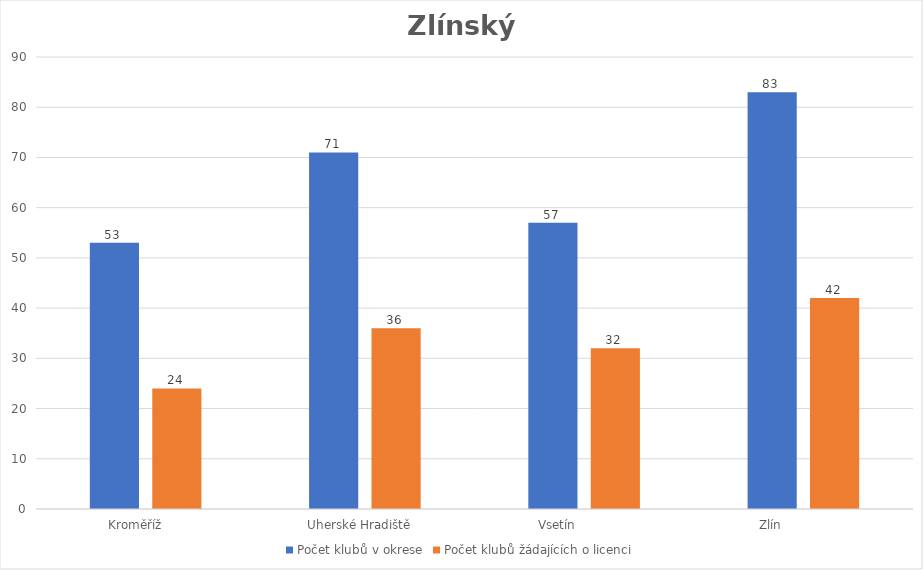
| Category | Počet klubů v okrese | Počet klubů žádajících o licenci |
|---|---|---|
| Kroměříž      | 53 | 24 |
| Uherské Hradiště   | 71 | 36 |
| Vsetín              | 57 | 32 |
| Zlín                 | 83 | 42 |